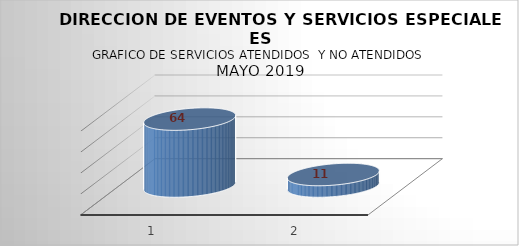
| Category | Series 0 |
|---|---|
| 0 | 64 |
| 1 | 11 |